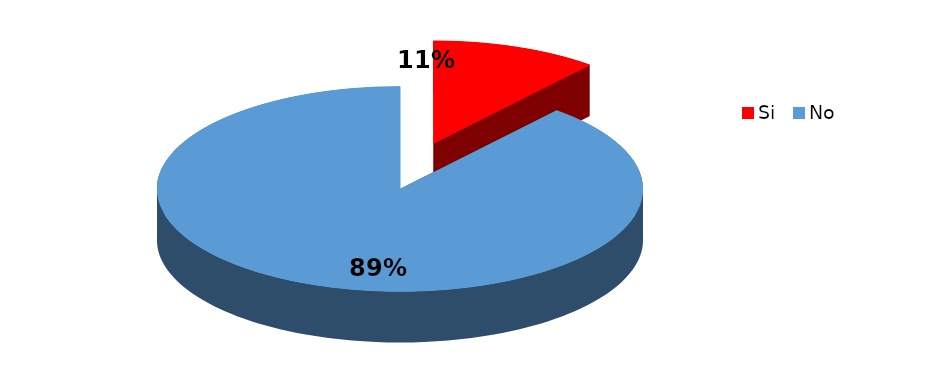
| Category | Series 0 |
|---|---|
| Si | 1 |
| No | 8 |